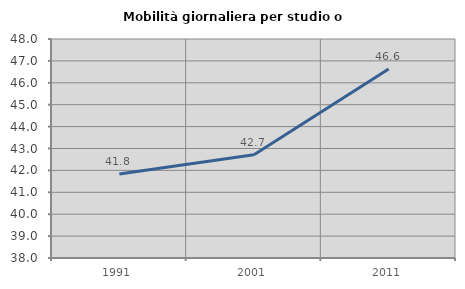
| Category | Mobilità giornaliera per studio o lavoro |
|---|---|
| 1991.0 | 41.838 |
| 2001.0 | 42.712 |
| 2011.0 | 46.626 |